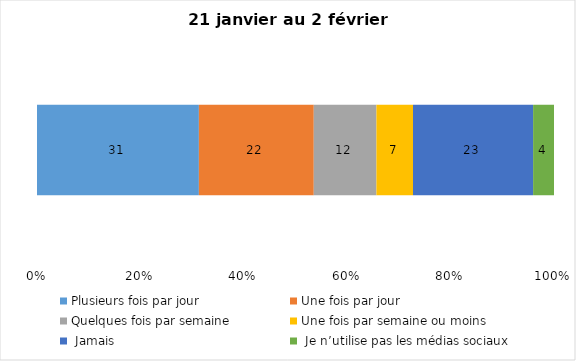
| Category | Plusieurs fois par jour | Une fois par jour | Quelques fois par semaine   | Une fois par semaine ou moins   |  Jamais   |  Je n’utilise pas les médias sociaux |
|---|---|---|---|---|---|---|
| 0 | 31 | 22 | 12 | 7 | 23 | 4 |